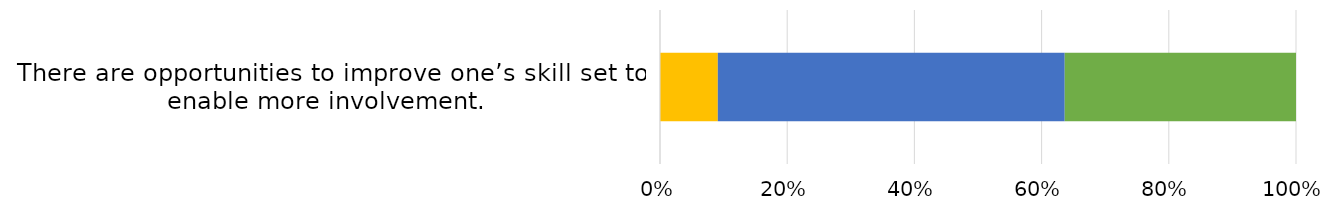
| Category | Strongly Disagree 
 | Disagree
 | Neither agree nor disagree
 | Agree
 | Strongly agree
 |
|---|---|---|---|---|---|
| There are opportunities to improve one’s skill set to enable more involvement. 
 | 0 | 0 | 0.091 | 0.545 | 0.364 |